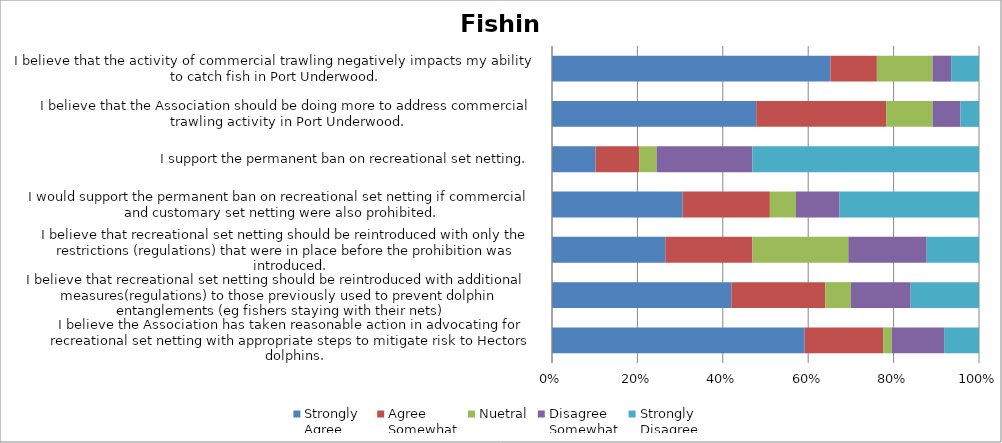
| Category | Strongly
Agree | Agree
Somewhat | Nuetral | Disagree
Somewhat | Strongly
Disagree |
|---|---|---|---|---|---|
| I believe the Association has taken reasonable action in advocating for recreational set netting with appropriate steps to mitigate risk to Hectors dolphins. | 29 | 9 | 1 | 6 | 4 |
| ÄI believe that recreational set netting should be reintroduced with additional  measures(regulations) to those previously used to prevent dolphin entanglements (eg fishers staying with their nets) | 21 | 11 | 3 | 7 | 8 |
| ¡I believe that recreational set netting should be reintroduced with only the restrictions (regulations) that were in place before the prohibition was introduced. | 13 | 10 | 11 | 9 | 6 |
| {I would support the permanent ban on recreational set netting if commercial and customary set netting were also prohibited. | 15 | 10 | 3 | 5 | 16 |
| 8I support the permanent ban on recreational set netting. | 5 | 5 | 2 | 11 | 26 |
| nI believe that the Association should be doing more to address commercial trawling activity in Port Underwood. | 22 | 14 | 5 | 3 | 2 |
| qI believe that the activity of commercial trawling negatively impacts my ability to catch fish in Port Underwood. | 30 | 5 | 6 | 2 | 3 |